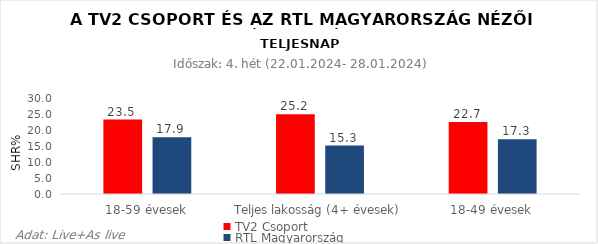
| Category | TV2 Csoport | RTL Magyarország |
|---|---|---|
| 18-59 évesek | 23.5 | 17.9 |
| Teljes lakosság (4+ évesek) | 25.2 | 15.3 |
| 18-49 évesek | 22.7 | 17.3 |